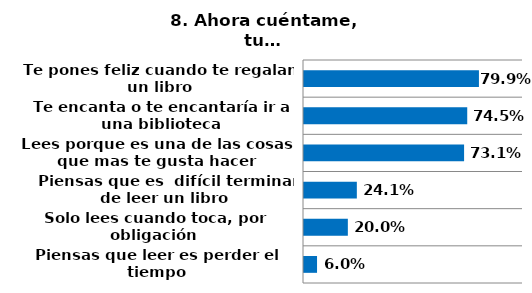
| Category | Series 0 |
|---|---|
| Te pones feliz cuando te regalan un libro | 0.799 |
| Te encanta o te encantaría ir a una biblioteca | 0.745 |
| Lees porque es una de las cosas que mas te gusta hacer | 0.731 |
| Piensas que es  difícil terminar de leer un libro  | 0.241 |
| Solo lees cuando toca, por obligación | 0.2 |
| Piensas que leer es perder el tiempo | 0.06 |